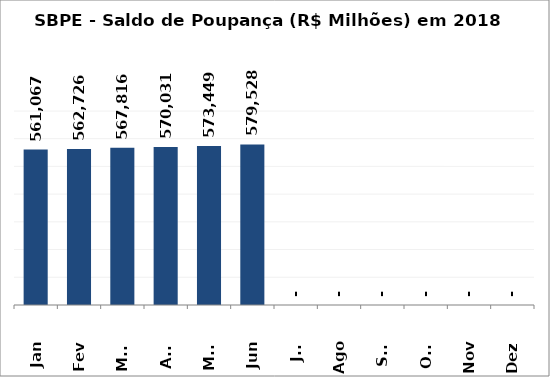
| Category | SBPE - Saldo de Poupança (R$ Milhões) em 2018 |
|---|---|
| Jan | 561067.029 |
| Fev | 562726.35 |
| Mar | 567815.814 |
| Abr | 570031.124 |
| Mai | 573448.941 |
| Jun | 579528.234 |
| Jul | 0 |
| Ago | 0 |
| Set | 0 |
| Out | 0 |
| Nov | 0 |
| Dez | 0 |